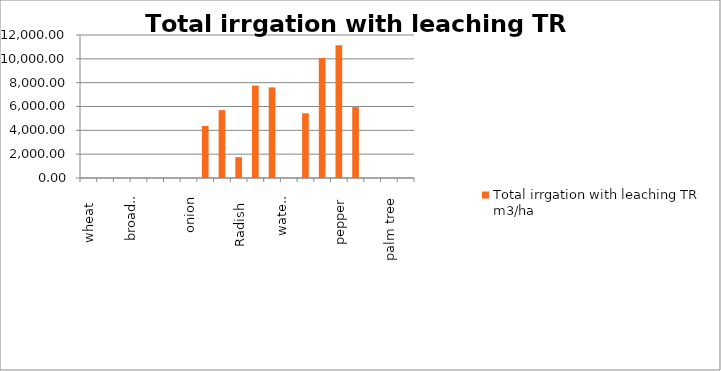
| Category | Total irrgation with leaching |
|---|---|
| wheat  | 0 |
| barley | 0 |
| peas* | 0 |
| broad beans* | 0 |
| oat | 0 |
| potato | 0 |
| onion | 0 |
| lettuce and Green-Leaf Crops | 4371.429 |
| carrot  | 5695.082 |
| Radish  | 1748.47 |
| Millets | 7752.727 |
| tomato | 7603.03 |
| water melon | 0 |
| cucumber | 5430.556 |
| eggplant | 10065.432 |
| pepper | 11133.67 |
| cauliflower | 5944.444 |
| olive tree | 0 |
| palm tree | 0 |
| alfalfa* | 0 |